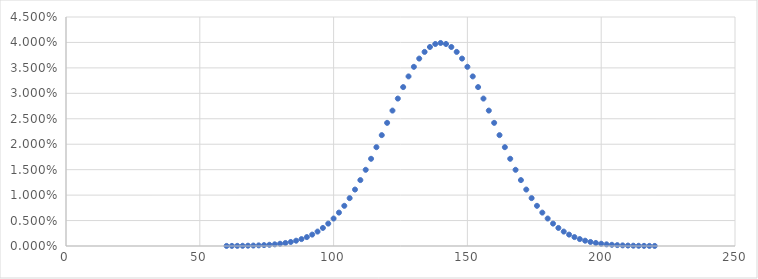
| Category | Series 0 |
|---|---|
| 60.0 | 0 |
| 62.0 | 0 |
| 64.0 | 0 |
| 66.0 | 0 |
| 68.0 | 0 |
| 70.0 | 0 |
| 72.0 | 0 |
| 74.0 | 0 |
| 76.0 | 0 |
| 78.0 | 0 |
| 80.0 | 0 |
| 82.0 | 0.001 |
| 84.0 | 0.001 |
| 86.0 | 0.001 |
| 88.0 | 0.001 |
| 90.0 | 0.002 |
| 92.0 | 0.002 |
| 94.0 | 0.003 |
| 96.0 | 0.004 |
| 98.0 | 0.004 |
| 100.0 | 0.005 |
| 102.0 | 0.007 |
| 104.0 | 0.008 |
| 106.0 | 0.009 |
| 108.0 | 0.011 |
| 110.0 | 0.013 |
| 112.0 | 0.015 |
| 114.0 | 0.017 |
| 116.0 | 0.019 |
| 118.0 | 0.022 |
| 120.0 | 0.024 |
| 122.0 | 0.027 |
| 124.0 | 0.029 |
| 126.0 | 0.031 |
| 128.0 | 0.033 |
| 130.0 | 0.035 |
| 132.0 | 0.037 |
| 134.0 | 0.038 |
| 136.0 | 0.039 |
| 138.0 | 0.04 |
| 140.0 | 0.04 |
| 142.0 | 0.04 |
| 144.0 | 0.039 |
| 146.0 | 0.038 |
| 148.0 | 0.037 |
| 150.0 | 0.035 |
| 152.0 | 0.033 |
| 154.0 | 0.031 |
| 156.0 | 0.029 |
| 158.0 | 0.027 |
| 160.0 | 0.024 |
| 162.0 | 0.022 |
| 164.0 | 0.019 |
| 166.0 | 0.017 |
| 168.0 | 0.015 |
| 170.0 | 0.013 |
| 172.0 | 0.011 |
| 174.0 | 0.009 |
| 176.0 | 0.008 |
| 178.0 | 0.007 |
| 180.0 | 0.005 |
| 182.0 | 0.004 |
| 184.0 | 0.004 |
| 186.0 | 0.003 |
| 188.0 | 0.002 |
| 190.0 | 0.002 |
| 192.0 | 0.001 |
| 194.0 | 0.001 |
| 196.0 | 0.001 |
| 198.0 | 0.001 |
| 200.0 | 0 |
| 202.0 | 0 |
| 204.0 | 0 |
| 206.0 | 0 |
| 208.0 | 0 |
| 210.0 | 0 |
| 212.0 | 0 |
| 214.0 | 0 |
| 216.0 | 0 |
| 218.0 | 0 |
| 220.0 | 0 |